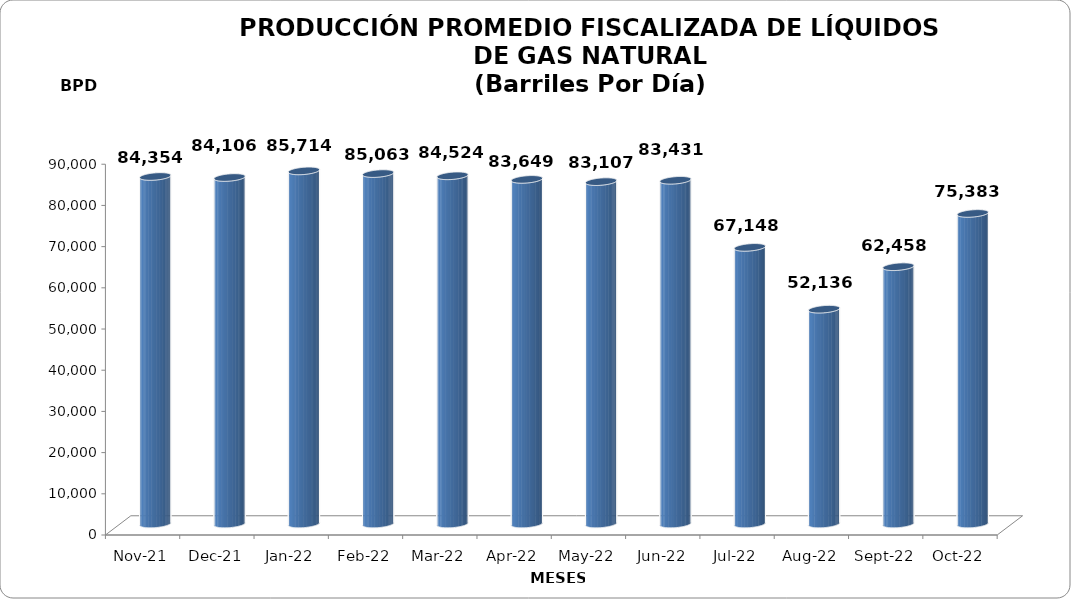
| Category | Series 0 |
|---|---|
| 2021-11-01 | 84354 |
| 2021-12-01 | 84106 |
| 2022-01-01 | 85714.355 |
| 2022-02-01 | 85063 |
| 2022-03-01 | 84523.548 |
| 2022-04-01 | 83649 |
| 2022-05-01 | 83107.387 |
| 2022-06-01 | 83430.867 |
| 2022-07-01 | 67147.806 |
| 2022-08-01 | 52135.548 |
| 2022-09-01 | 62458.2 |
| 2022-10-01 | 75383.161 |